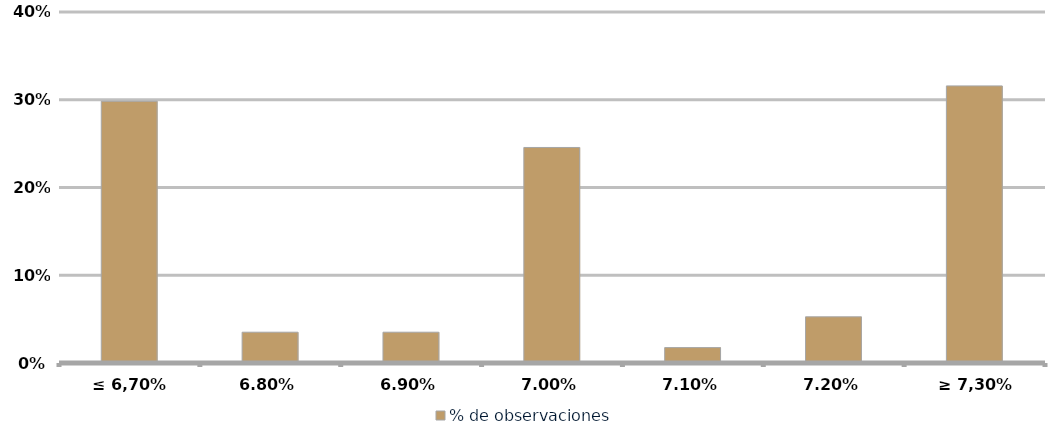
| Category | % de observaciones  |
|---|---|
| ≤ 6,70% | 0.298 |
| 6,80% | 0.035 |
| 6,90% | 0.035 |
| 7,00% | 0.246 |
| 7,10% | 0.018 |
| 7,20% | 0.053 |
| ≥ 7,30% | 0.316 |